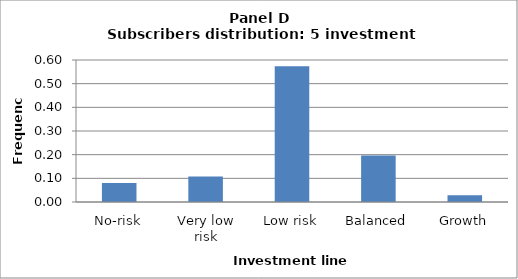
| Category | Series 0 |
|---|---|
| No-risk | 0.08 |
| Very low risk | 0.108 |
| Low risk | 0.574 |
| Balanced | 0.196 |
| Growth | 0.028 |